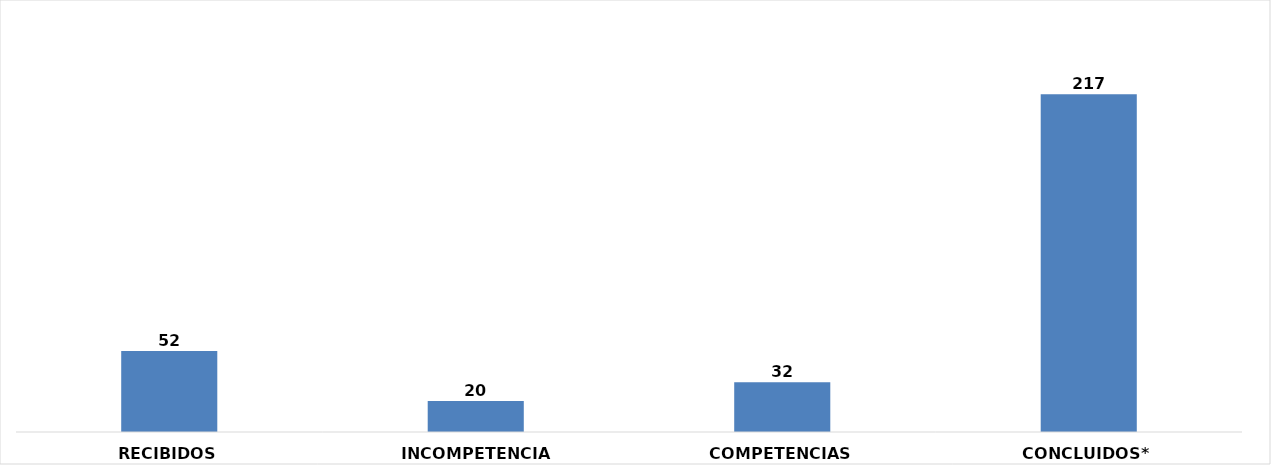
| Category | CANTIDAD |
|---|---|
| RECIBIDOS | 52 |
| INCOMPETENCIAS | 20 |
| COMPETENCIAS | 32 |
| CONCLUIDOS* | 217 |